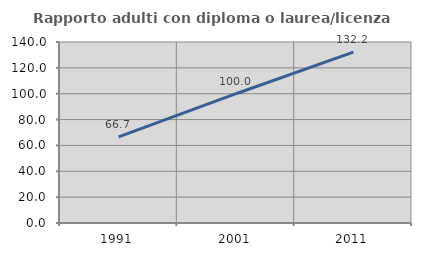
| Category | Rapporto adulti con diploma o laurea/licenza media  |
|---|---|
| 1991.0 | 66.667 |
| 2001.0 | 100 |
| 2011.0 | 132.203 |